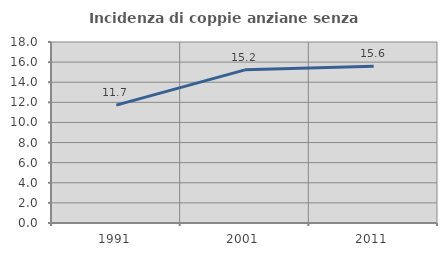
| Category | Incidenza di coppie anziane senza figli  |
|---|---|
| 1991.0 | 11.721 |
| 2001.0 | 15.229 |
| 2011.0 | 15.588 |